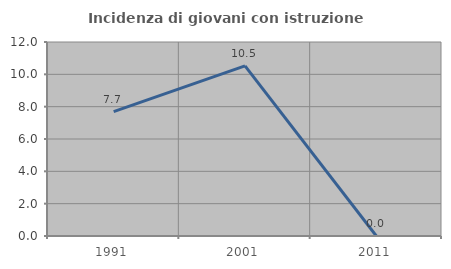
| Category | Incidenza di giovani con istruzione universitaria |
|---|---|
| 1991.0 | 7.692 |
| 2001.0 | 10.526 |
| 2011.0 | 0 |